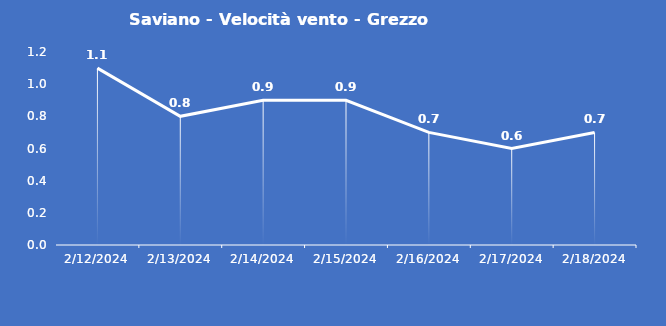
| Category | Saviano - Velocità vento - Grezzo (m/s) |
|---|---|
| 2/12/24 | 1.1 |
| 2/13/24 | 0.8 |
| 2/14/24 | 0.9 |
| 2/15/24 | 0.9 |
| 2/16/24 | 0.7 |
| 2/17/24 | 0.6 |
| 2/18/24 | 0.7 |